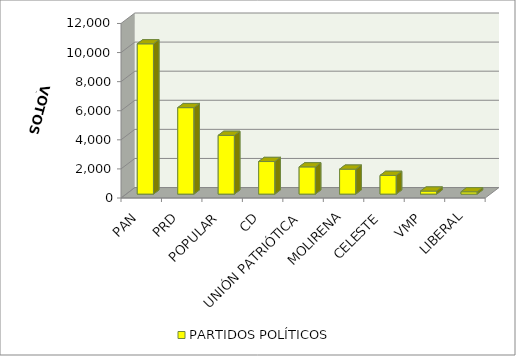
| Category | PARTIDOS POLÍTICOS |
|---|---|
| PAN | 10333 |
| PRD | 5945 |
| POPULAR | 4038 |
| CD | 2240 |
| UNIÓN PATRIÓTICA | 1871 |
| MOLIRENA | 1714 |
| CELESTE | 1285 |
| VMP | 207 |
| LIBERAL | 156 |